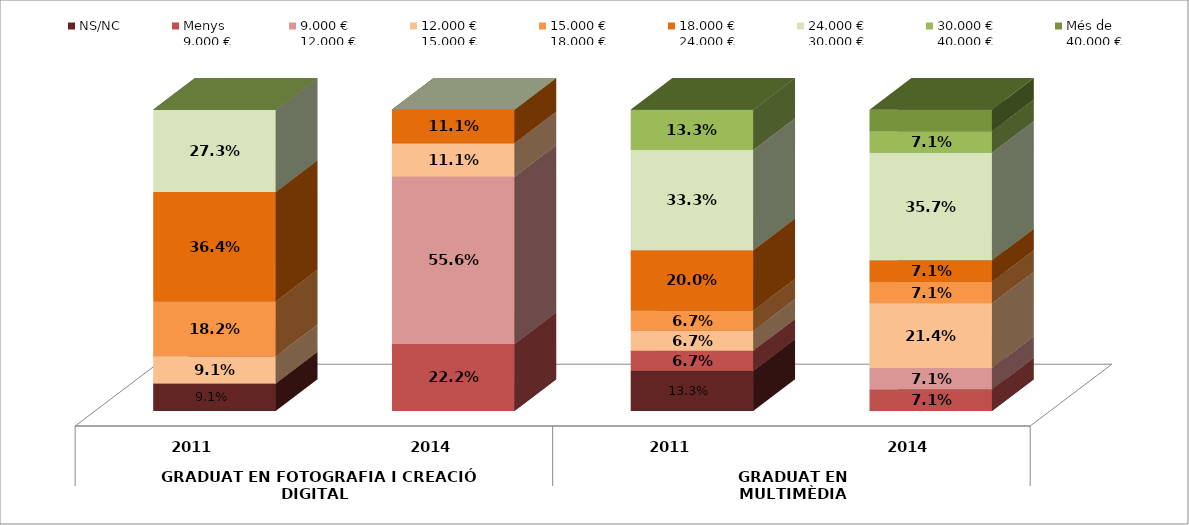
| Category | NS/NC | Menys 
9.000 € | 9.000 €
12.000 € | 12.000 €
15.000 € | 15.000 €
18.000 € | 18.000 €
24.000 € | 24.000 €
30.000 € | 30.000 €
40.000 € | Més de 
40.000 € |
|---|---|---|---|---|---|---|---|---|---|
| 0 | 0.091 | 0 | 0 | 0.091 | 0.182 | 0.364 | 0.273 | 0 | 0 |
| 1 | 0 | 0.222 | 0.556 | 0.111 | 0 | 0.111 | 0 | 0 | 0 |
| 2 | 0.133 | 0.067 | 0 | 0.067 | 0.067 | 0.2 | 0.333 | 0.133 | 0 |
| 3 | 0 | 0.071 | 0.071 | 0.214 | 0.071 | 0.071 | 0.357 | 0.071 | 0.071 |